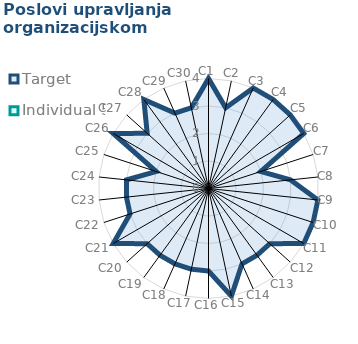
| Category | Target | Individual 5 |
|---|---|---|
| C1 | 4 | 0 |
| C2 | 3 | 0 |
| C3 | 4 | 0 |
| C4 | 4 | 0 |
| C5 | 4 | 0 |
| C6 | 4 | 0 |
| C7 | 2 | 0 |
| C8 | 3 | 0 |
| C9 | 4 | 0 |
| C10 | 4 | 0 |
| C11 | 4 | 0 |
| C12 | 3 | 0 |
| C13 | 3 | 0 |
| C14 | 3 | 0 |
| C15 | 4 | 0 |
| C16 | 3 | 0 |
| C17 | 3 | 0 |
| C18 | 3 | 0 |
| C19 | 3 | 0 |
| C20 | 3 | 0 |
| C21 | 4 | 0 |
| C22 | 3 | 0 |
| C23 | 3 | 0 |
| C24 | 3 | 0 |
| C25 | 2 | 0 |
| C26 | 4 | 0 |
| C27 | 3 | 0 |
| C28 | 4 | 0 |
| C29 | 3 | 0 |
| C30 | 3 | 0 |